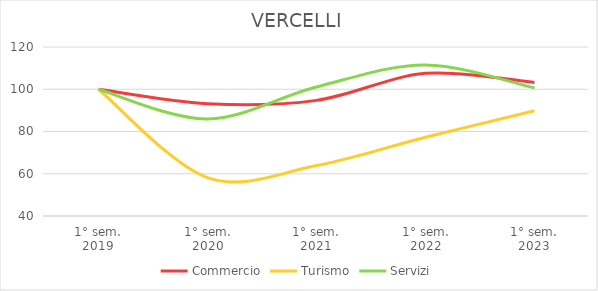
| Category | Commercio | Turismo | Servizi |
|---|---|---|---|
| 1° sem.
2019 | 100 | 100 | 100 |
| 1° sem.
2020 | 93.189 | 58.184 | 85.939 |
| 1° sem.
2021 | 94.737 | 63.879 | 101.078 |
| 1° sem.
2022 | 107.534 | 77.27 | 111.5 |
| 1° sem.
2023 | 103.199 | 89.841 | 100.606 |